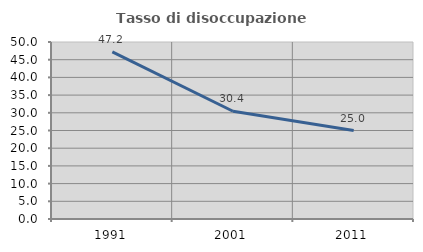
| Category | Tasso di disoccupazione giovanile  |
|---|---|
| 1991.0 | 47.222 |
| 2001.0 | 30.435 |
| 2011.0 | 25 |